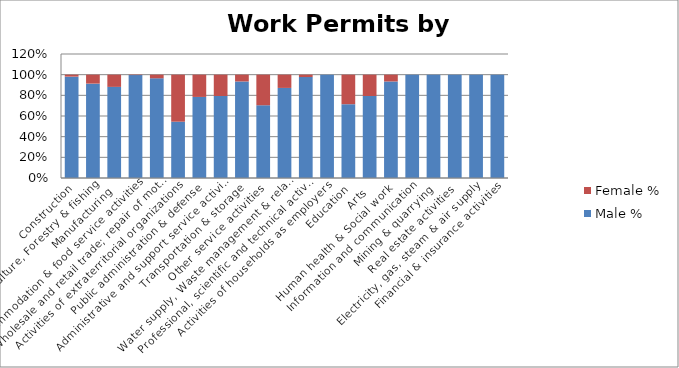
| Category | Male % | Female % |
|---|---|---|
| Construction | 0.981 | 0.019 |
| Agriculture, Forestry & fishing | 0.913 | 0.087 |
| Manufacturing | 0.882 | 0.118 |
| Accommodation & food service activities | 0.996 | 0.004 |
| Wholesale and retail trade; repair of motor vehicles  | 0.965 | 0.035 |
| Activities of extraterritorial organizations  | 0.545 | 0.455 |
| Public administration & defense | 0.784 | 0.216 |
| Administrative and support service activities | 0.794 | 0.206 |
|  Transportation & storage | 0.934 | 0.066 |
| Other service activities | 0.704 | 0.296 |
| Water supply, Waste management & related activities | 0.872 | 0.128 |
| Professional, scientific and technical activities | 0.977 | 0.023 |
| Activities of households as employers | 1 | 0 |
| Education | 0.714 | 0.286 |
| Arts | 0.794 | 0.206 |
| Human health & Social work | 0.934 | 0.066 |
|  Information and communication | 1 | 0 |
| Mining & quarrying | 1 | 0 |
| Real estate activities | 1 | 0 |
| Electricity, gas, steam & air supply | 1 | 0 |
| Financial & insurance activities | 1 | 0 |